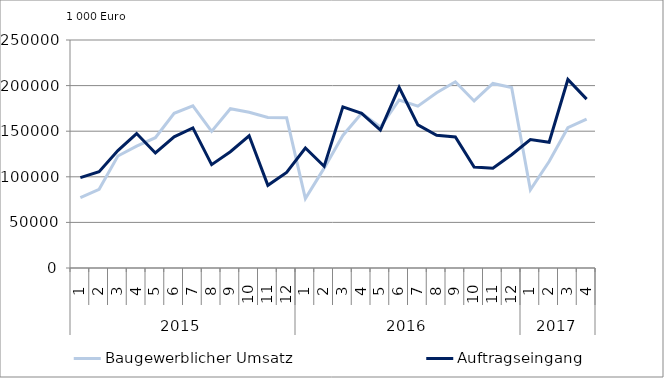
| Category | Baugewerblicher Umsatz | Auftragseingang |
|---|---|---|
| 0 | 77137.228 | 99023.008 |
| 1 | 86257.027 | 105491.844 |
| 2 | 122760.234 | 128704.324 |
| 3 | 133614.814 | 147438.665 |
| 4 | 142869.83 | 126182.175 |
| 5 | 169564.381 | 143879.815 |
| 6 | 177708.819 | 153660.001 |
| 7 | 149762.789 | 113338.261 |
| 8 | 174633.481 | 127520.775 |
| 9 | 170827.145 | 144931.886 |
| 10 | 165122.384 | 90621.16 |
| 11 | 164674.971 | 104795.622 |
| 12 | 76043.538 | 131571.482 |
| 13 | 109483.268 | 111467.248 |
| 14 | 145343.559 | 176673.268 |
| 15 | 169660.551 | 169566.96 |
| 16 | 154554.865 | 151228.165 |
| 17 | 184236.137 | 198035.655 |
| 18 | 177444.278 | 156900.898 |
| 19 | 192230.472 | 145537.167 |
| 20 | 204178.065 | 143616.217 |
| 21 | 183173.849 | 110770.94 |
| 22 | 202302.279 | 109384.188 |
| 23 | 197832.096 | 124193.91 |
| 24 | 85701.947 | 140751.008 |
| 25 | 116743.276 | 137863.383 |
| 26 | 153810.055 | 206710.579 |
| 27 | 163342.989 | 185183.797 |